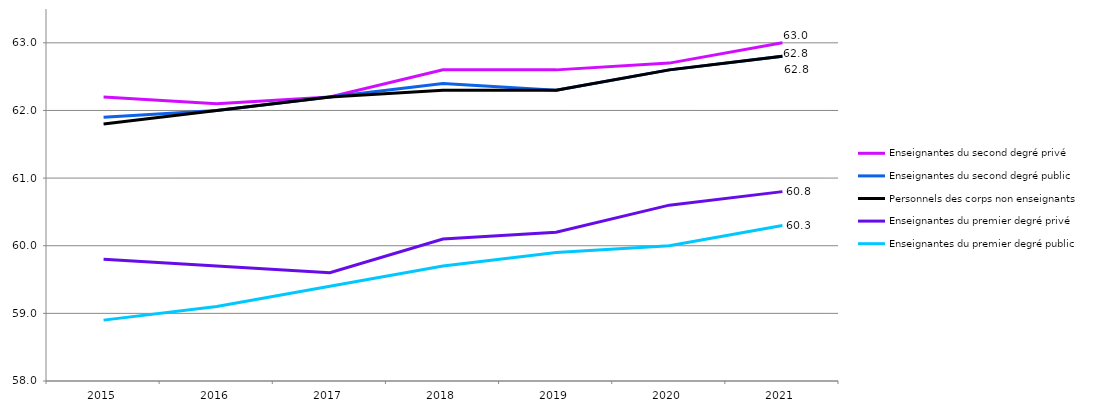
| Category | Enseignantes du second degré privé | Enseignantes du second degré public | Personnels des corps non enseignants  | Enseignantes du premier degré privé | Enseignantes du premier degré public |
|---|---|---|---|---|---|
| 2015.0 | 62.2 | 61.9 | 61.8 | 59.8 | 58.9 |
| 2016.0 | 62.1 | 62 | 62 | 59.7 | 59.1 |
| 2017.0 | 62.2 | 62.2 | 62.2 | 59.6 | 59.4 |
| 2018.0 | 62.6 | 62.4 | 62.3 | 60.1 | 59.7 |
| 2019.0 | 62.6 | 62.3 | 62.3 | 60.2 | 59.9 |
| 2020.0 | 62.7 | 62.6 | 62.6 | 60.6 | 60 |
| 2021.0 | 63 | 62.8 | 62.8 | 60.8 | 60.3 |